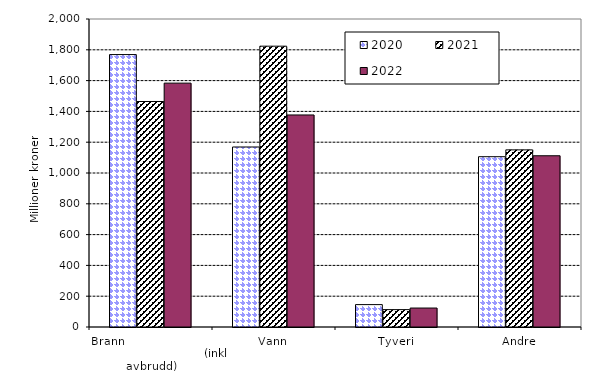
| Category | 2020 | 2021 | 2022 |
|---|---|---|---|
| Brann                                                       (inkl avbrudd) | 1769.074 | 1464.198 | 1583.578 |
| Vann | 1168.864 | 1823.524 | 1376.879 |
| Tyveri | 145.453 | 112.873 | 123.137 |
| Andre | 1105.888 | 1150.229 | 1112 |